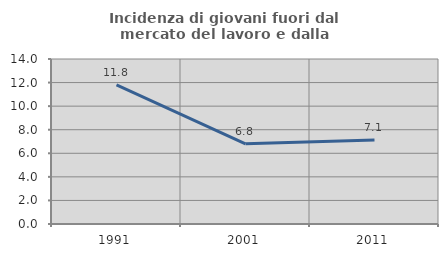
| Category | Incidenza di giovani fuori dal mercato del lavoro e dalla formazione  |
|---|---|
| 1991.0 | 11.803 |
| 2001.0 | 6.801 |
| 2011.0 | 7.122 |